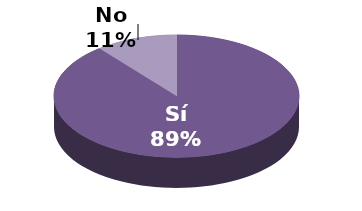
| Category | Series 1 |
|---|---|
| Sí | 33 |
| No | 4 |